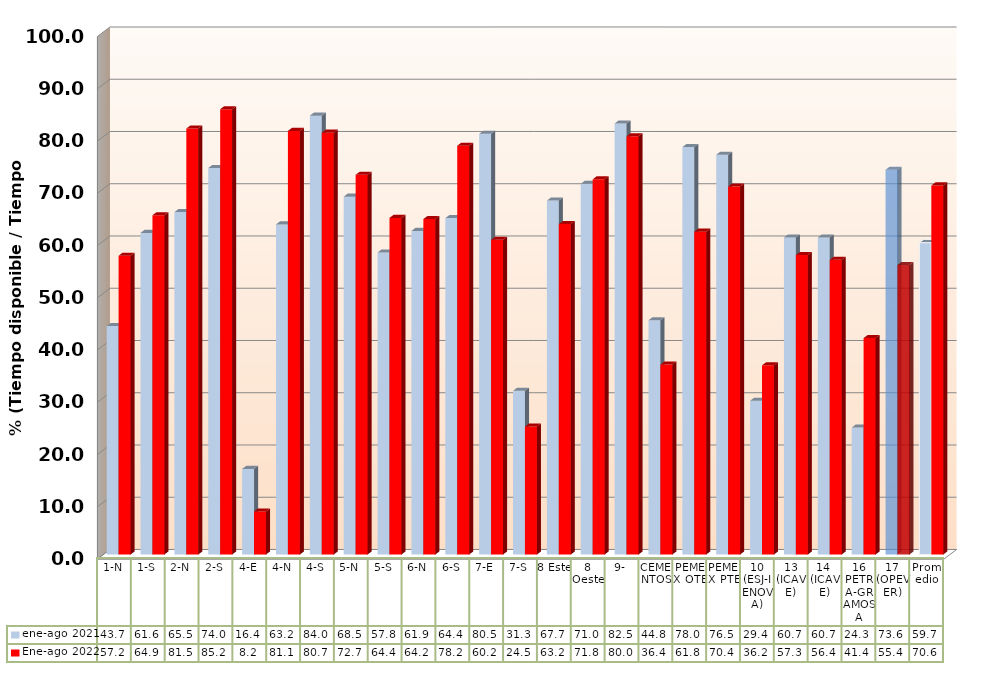
| Category | ene-ago 2021 | Ene-ago 2022 |
|---|---|---|
| 1-N | 43.74 | 57.191 |
| 1-S | 61.561 | 64.935 |
| 2-N | 65.537 | 81.535 |
| 2-S | 73.983 | 85.231 |
| 4-E | 16.385 | 8.243 |
| 4-N | 63.186 | 81.077 |
| 4-S | 84 | 80.736 |
| 5-N | 68.499 | 72.678 |
| 5-S | 57.813 | 64.434 |
| 6-N | 61.941 | 64.213 |
| 6-S | 64.388 | 78.241 |
| 7-E | 80.526 | 60.232 |
| 7-S | 31.332 | 24.492 |
| 8 Este | 67.746 | 63.241 |
| 8 Oeste | 70.955 | 71.809 |
| 9- | 82.504 | 80.048 |
| CEMENTOS | 44.833 | 36.36 |
| PEMEX OTE | 77.979 | 61.795 |
| PEMEX PTE | 76.519 | 70.439 |
| 10 (ESJ-IENOVA) | 29.433 | 36.211 |
| 13 (ICAVE) | 60.684 | 57.315 |
| 14  (ICAVE) | 60.684 | 56.402 |
| 16 PETRA-GRAMOSA | 24.294 | 41.433 |
| 17 (OPEVER) | 73.639 | 55.409 |
| Promedio | 59.696 | 70.64 |